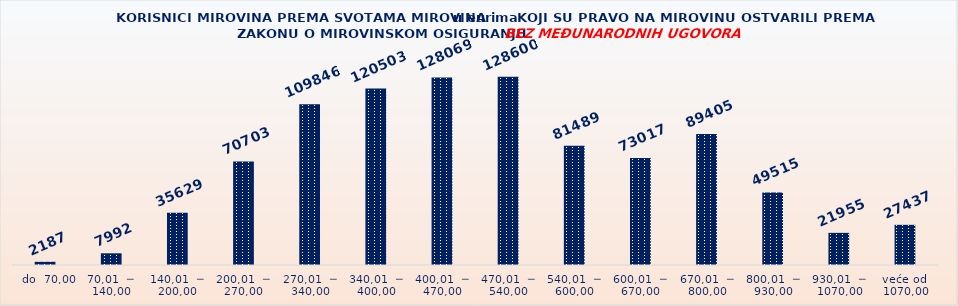
| Category | KORISNICI MIROVINA PREMA VRSTAMA I SVOTAMA MIROVINA KOJI SU PRAVO NA MIROVINU OSTVARILI PREMA ZAKONU O MIROVINSKOM OSIGURANJU 
BEZ MEĐUNARODNIH UGOVORA |
|---|---|
|   do  70,00 | 2187 |
| 70,01  ─  140,00 | 7992 |
| 140,01  ─  200,00 | 35629 |
| 200,01  ─  270,00 | 70703 |
| 270,01  ─  340,00 | 109846 |
| 340,01  ─  400,00 | 120503 |
| 400,01  ─  470,00 | 128069 |
| 470,01  ─  540,00 | 128600 |
| 540,01  ─  600,00 | 81489 |
| 600,01  ─  670,00 | 73017 |
| 670,01  ─  800,00 | 89405 |
| 800,01  ─  930,00 | 49515 |
| 930,01  ─  1070,00 | 21955 |
| veće od  1070,00 | 27437 |